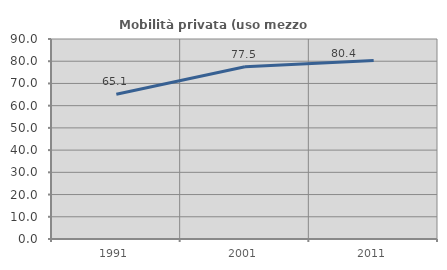
| Category | Mobilità privata (uso mezzo privato) |
|---|---|
| 1991.0 | 65.148 |
| 2001.0 | 77.496 |
| 2011.0 | 80.357 |